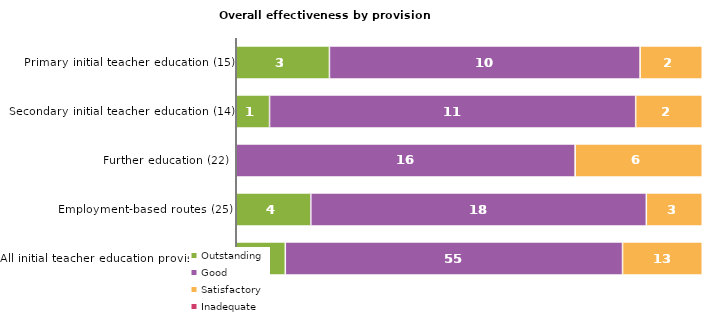
| Category | Outstanding | Good | Satisfactory | Inadequate |
|---|---|---|---|---|
| Primary initial teacher education (15) | 3 | 10 | 2 | 0 |
| Secondary initial teacher education (14) | 1 | 11 | 2 | 0 |
| Further education (22) | 0 | 16 | 6 | 0 |
| Employment-based routes (25) | 4 | 18 | 3 | 0 |
| All initial teacher education provision (76) | 8 | 55 | 13 | 0 |